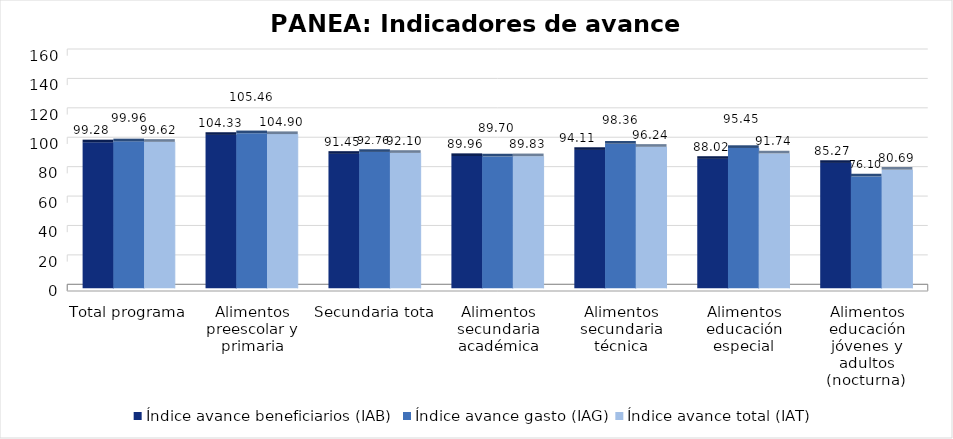
| Category | Índice avance beneficiarios (IAB)  | Índice avance gasto (IAG) | Índice avance total (IAT)  |
|---|---|---|---|
| Total programa | 99.279 | 99.959 | 99.619 |
| Alimentos preescolar y primaria | 104.329 | 105.464 | 104.896 |
| Secundaria total | 91.453 | 92.755 | 92.104 |
| Alimentos secundaria académica | 89.958 | 89.704 | 89.831 |
| Alimentos secundaria técnica | 94.113 | 98.363 | 96.238 |
| Alimentos educación especial | 88.022 | 95.452 | 91.737 |
| Alimentos educación jóvenes y adultos (nocturna)  | 85.274 | 76.104 | 80.689 |